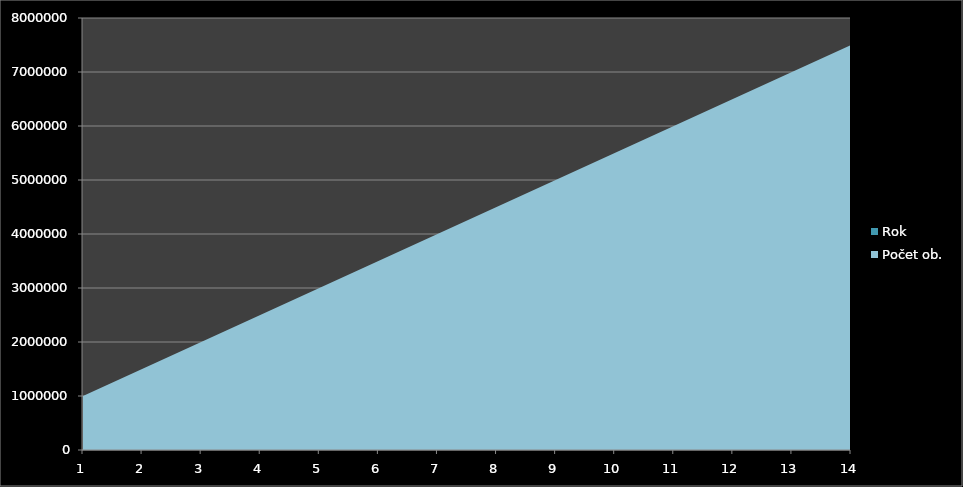
| Category | Rok | Počet ob. |
|---|---|---|
| 0 | 2000 | 1000000 |
| 1 | 2001 | 1500000 |
| 2 | 2002 | 2000000 |
| 3 | 2003 | 2500000 |
| 4 | 2004 | 3000000 |
| 5 | 2005 | 3500000 |
| 6 | 2006 | 4000000 |
| 7 | 2007 | 4500000 |
| 8 | 2008 | 5000000 |
| 9 | 2009 | 5500000 |
| 10 | 2010 | 6000000 |
| 11 | 2011 | 6500000 |
| 12 | 2012 | 7000000 |
| 13 | 2013 | 7500000 |